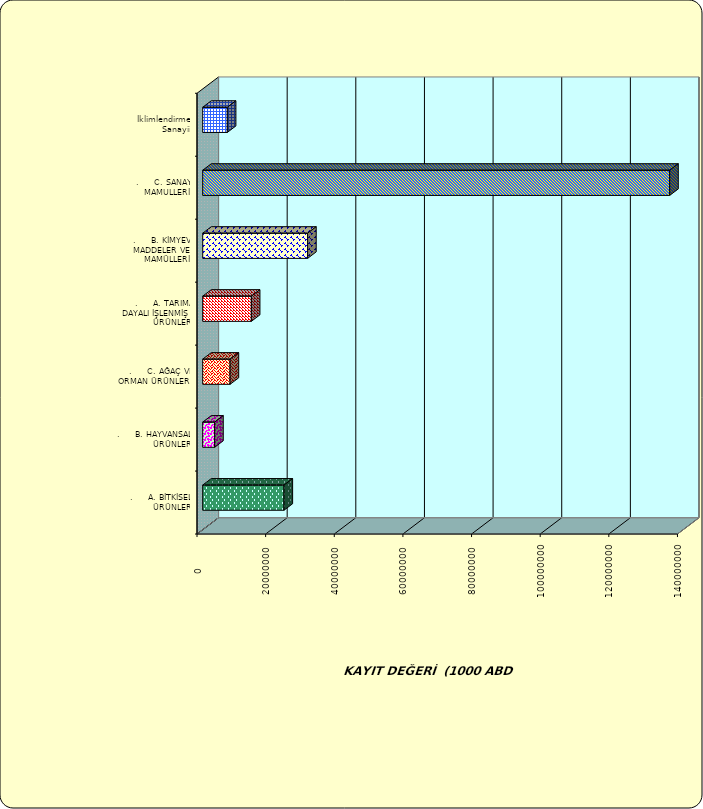
| Category | Series 0 |
|---|---|
| .     A. BİTKİSEL ÜRÜNLER | 23693610.726 |
| .     B. HAYVANSAL ÜRÜNLER | 3486857.447 |
| .     C. AĞAÇ VE ORMAN ÜRÜNLERİ | 7983784.96 |
| .     A. TARIMA DAYALI İŞLENMİŞ ÜRÜNLER | 14172088.724 |
| .     B. KİMYEVİ MADDELER VE MAMÜLLERİ | 30572011.916 |
| .     C. SANAYİ MAMULLERİ | 136074522.25 |
|  İklimlendirme Sanayii | 7169534.078 |